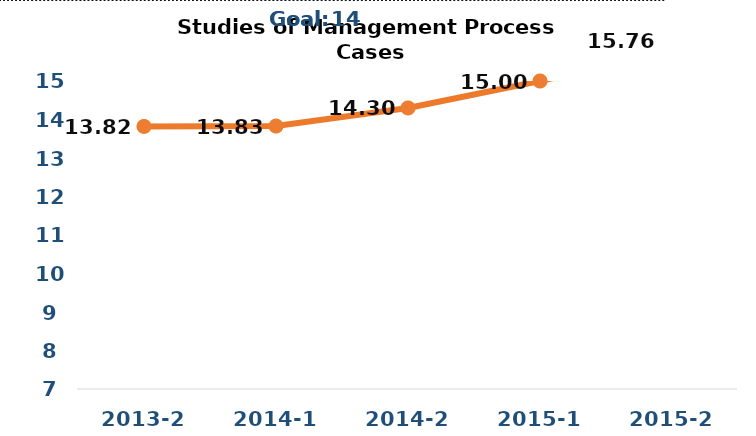
| Category | Series 0 |
|---|---|
| 2013-2 | 13.82 |
| 2014-1 | 13.83 |
| 2014-2 | 14.3 |
| 2015-1 | 15 |
| 2015-2 | 15.76 |